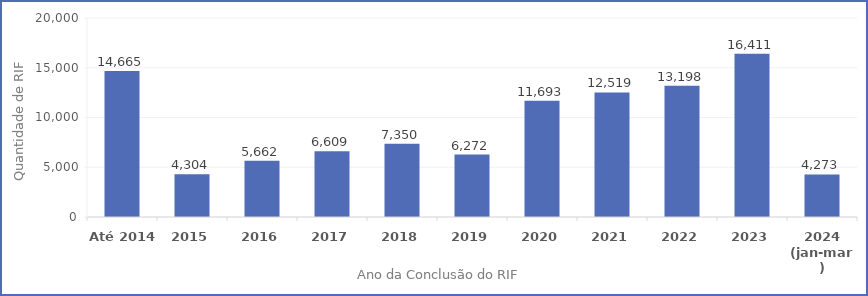
| Category | Quantidade de RIFs Concluídos |
|---|---|
| Até 2014 | 14665 |
| 2015 | 4304 |
| 2016 | 5662 |
| 2017 | 6609 |
| 2018 | 7350 |
| 2019 | 6272 |
| 2020 | 11693 |
| 2021 | 12519 |
| 2022 | 13198 |
| 2023 | 16411 |
| 2024
(jan-mar) | 4273 |